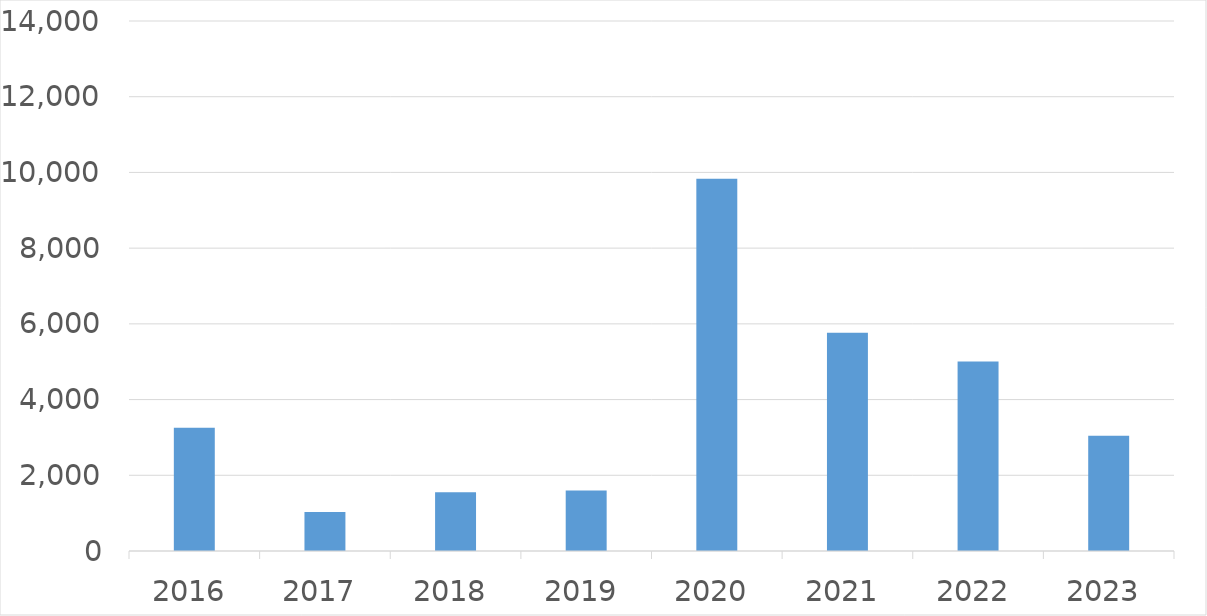
| Category | Series 0 |
|---|---|
| 2016 | 3257 |
| 2017 | 1029 |
| 2018 | 1552 |
| 2019 | 1600 |
| 2020 | 9835 |
| 2021 | 5767 |
| 2022 | 5003 |
| 2023 | 3046 |